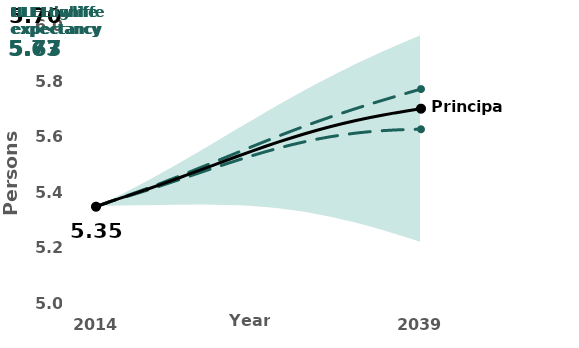
| Category | HLE |
|---|---|
| 2014.0 | 5.348 |
| 2015.0 | 5.365 |
| 2016.0 | 5.381 |
| 2017.0 | 5.398 |
| 2018.0 | 5.415 |
| 2019.0 | 5.432 |
| 2020.0 | 5.451 |
| 2021.0 | 5.469 |
| 2022.0 | 5.488 |
| 2023.0 | 5.507 |
| 2024.0 | 5.526 |
| 2025.0 | 5.546 |
| 2026.0 | 5.565 |
| 2027.0 | 5.583 |
| 2028.0 | 5.602 |
| 2029.0 | 5.62 |
| 2030.0 | 5.638 |
| 2031.0 | 5.655 |
| 2032.0 | 5.671 |
| 2033.0 | 5.687 |
| 2034.0 | 5.702 |
| 2035.0 | 5.717 |
| 2036.0 | 5.731 |
| 2037.0 | 5.745 |
| 2038.0 | 5.759 |
| 2039.0 | 5.772 |